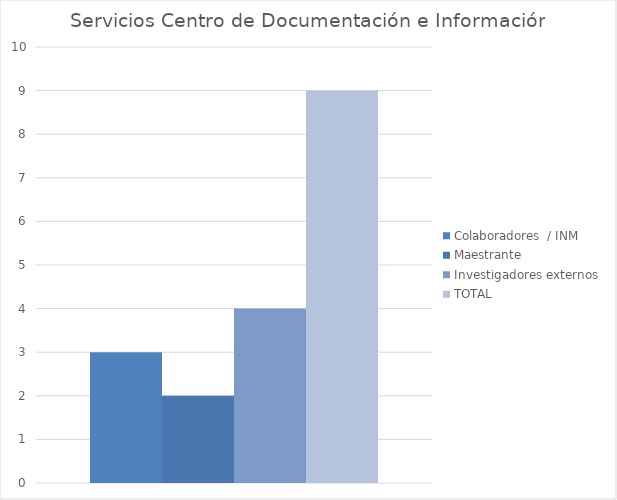
| Category | Colaboradores  / INM | Maestrante | Investigadores externos | TOTAL  |
|---|---|---|---|---|
| 0 | 3 | 2 | 4 | 9 |